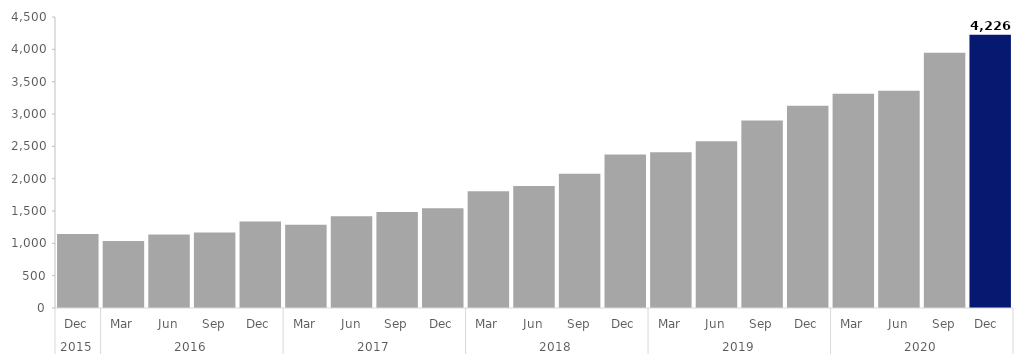
| Category | Series 0 |
|---|---|
| 0 | 1143 |
| 1 | 1036 |
| 2 | 1135 |
| 3 | 1168 |
| 4 | 1339 |
| 5 | 1289 |
| 6 | 1420 |
| 7 | 1483 |
| 8 | 1543 |
| 9 | 1805 |
| 10 | 1885 |
| 11 | 2076 |
| 12 | 2374 |
| 13 | 2407 |
| 14 | 2580 |
| 15 | 2901 |
| 16 | 3126 |
| 17 | 3312 |
| 18 | 3359 |
| 19 | 3948 |
| 20 | 4226 |